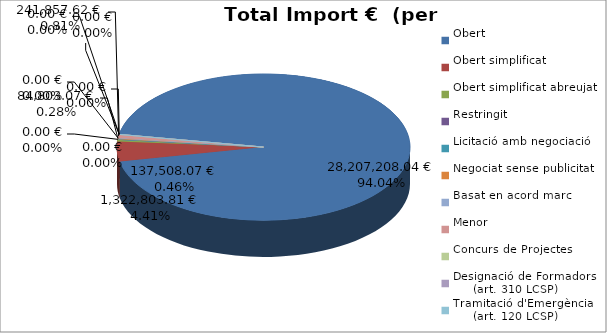
| Category | Total preu
(amb IVA) |
|---|---|
| Obert | 28207208.04 |
| Obert simplificat | 1322803.81 |
| Obert simplificat abreujat | 137508.07 |
| Restringit | 0 |
| Licitació amb negociació | 0 |
| Negociat sense publicitat | 84803.07 |
| Basat en acord marc | 0 |
| Menor | 241857.62 |
| Concurs de Projectes | 0 |
| Designació de Formadors
     (art. 310 LCSP) | 0 |
| Tramitació d'Emergència
     (art. 120 LCSP) | 0 |